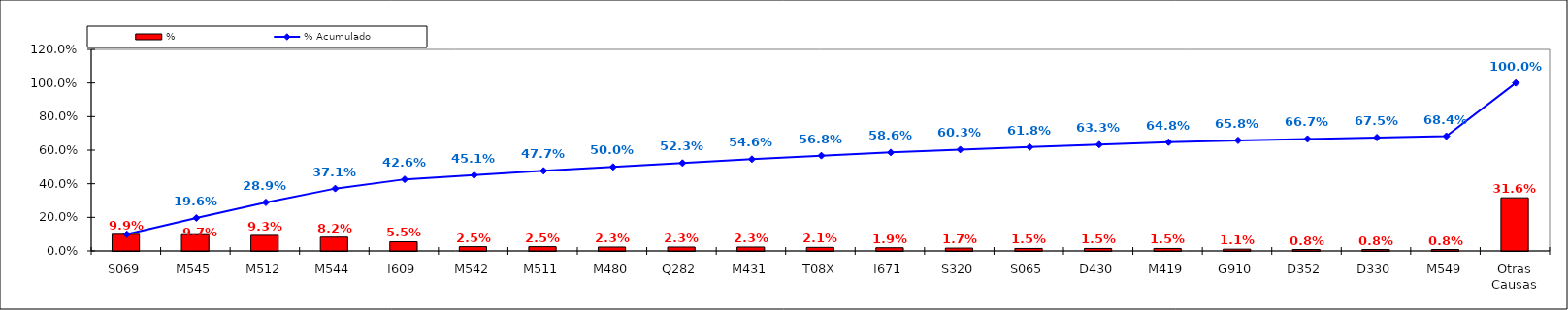
| Category | % |
|---|---|
| S069 | 0.099 |
| M545 | 0.097 |
| M512 | 0.093 |
| M544 | 0.082 |
| I609 | 0.055 |
| M542 | 0.025 |
| M511 | 0.025 |
| M480 | 0.023 |
| Q282 | 0.023 |
| M431 | 0.023 |
| T08X | 0.021 |
| I671 | 0.019 |
| S320 | 0.017 |
| S065 | 0.015 |
| D430 | 0.015 |
| M419 | 0.015 |
| G910 | 0.011 |
| D352 | 0.008 |
| D330 | 0.008 |
| M549 | 0.008 |
| Otras Causas | 0.316 |